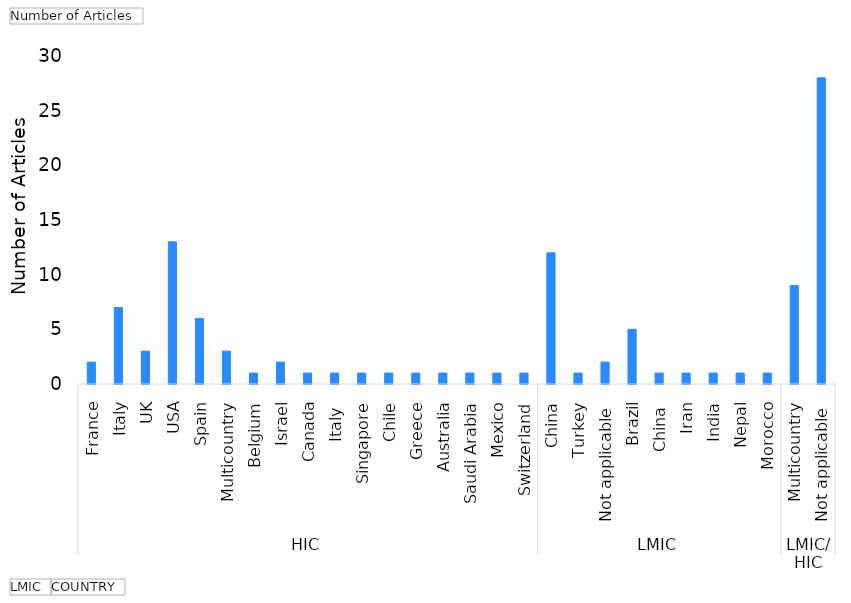
| Category | Total |
|---|---|
| 0 | 2 |
| 1 | 7 |
| 2 | 3 |
| 3 | 13 |
| 4 | 6 |
| 5 | 3 |
| 6 | 1 |
| 7 | 2 |
| 8 | 1 |
| 9 | 1 |
| 10 | 1 |
| 11 | 1 |
| 12 | 1 |
| 13 | 1 |
| 14 | 1 |
| 15 | 1 |
| 16 | 1 |
| 17 | 12 |
| 18 | 1 |
| 19 | 2 |
| 20 | 5 |
| 21 | 1 |
| 22 | 1 |
| 23 | 1 |
| 24 | 1 |
| 25 | 1 |
| 26 | 9 |
| 27 | 28 |